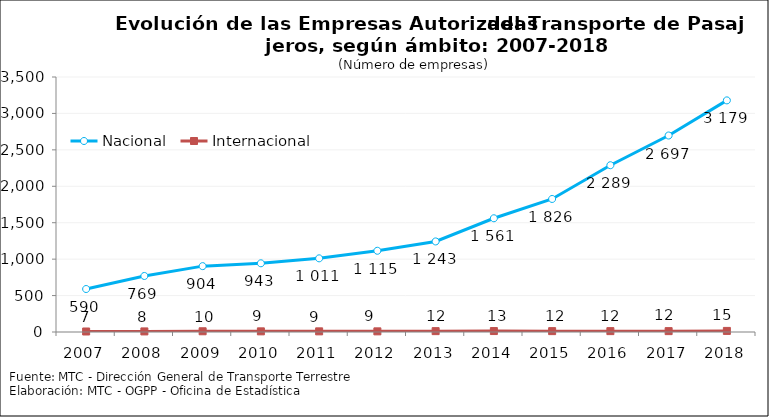
| Category | Nacional | Internacional |
|---|---|---|
| 2007.0 | 590 | 7 |
| 2008.0 | 769 | 8 |
| 2009.0 | 904 | 10 |
| 2010.0 | 943 | 9 |
| 2011.0 | 1011 | 9 |
| 2012.0 | 1115 | 9 |
| 2013.0 | 1243 | 12 |
| 2014.0 | 1561 | 13 |
| 2015.0 | 1826 | 12 |
| 2016.0 | 2289 | 12 |
| 2017.0 | 2697 | 12 |
| 2018.0 | 3179 | 15 |